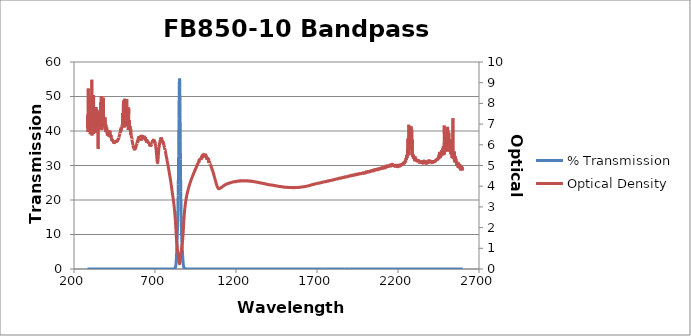
| Category | % Transmission |
|---|---|
| 2600.0 | 0.002 |
| 2599.0 | 0.001 |
| 2598.0 | 0.002 |
| 2597.0 | 0.002 |
| 2596.0 | 0.001 |
| 2595.0 | 0.001 |
| 2594.0 | 0.001 |
| 2593.0 | 0.001 |
| 2592.0 | 0.001 |
| 2591.0 | 0.001 |
| 2590.0 | 0.002 |
| 2589.0 | 0.001 |
| 2588.0 | 0.001 |
| 2587.0 | 0.002 |
| 2586.0 | 0.001 |
| 2585.0 | 0.001 |
| 2584.0 | 0.001 |
| 2583.0 | 0.001 |
| 2582.0 | 0.001 |
| 2581.0 | 0.001 |
| 2580.0 | 0.001 |
| 2579.0 | 0.001 |
| 2578.0 | 0.001 |
| 2577.0 | 0.001 |
| 2576.0 | 0.001 |
| 2575.0 | 0.001 |
| 2574.0 | 0.001 |
| 2573.0 | 0.001 |
| 2572.0 | 0.001 |
| 2571.0 | 0.001 |
| 2570.0 | 0.001 |
| 2569.0 | 0.001 |
| 2568.0 | 0.001 |
| 2567.0 | 0.001 |
| 2566.0 | 0.001 |
| 2565.0 | 0.001 |
| 2564.0 | 0.001 |
| 2563.0 | 0.001 |
| 2562.0 | 0.001 |
| 2561.0 | 0.001 |
| 2560.0 | 0.001 |
| 2559.0 | 0.001 |
| 2558.0 | 0 |
| 2557.0 | 0.001 |
| 2556.0 | 0.001 |
| 2555.0 | 0 |
| 2554.0 | 0.001 |
| 2553.0 | 0 |
| 2552.0 | 0 |
| 2551.0 | 0 |
| 2550.0 | 0.001 |
| 2549.0 | 0 |
| 2548.0 | 0.001 |
| 2547.0 | 0.001 |
| 2546.0 | 0 |
| 2545.0 | 0 |
| 2544.0 | 0 |
| 2543.0 | 0 |
| 2542.0 | 0 |
| 2541.0 | 0 |
| 2540.0 | 0 |
| 2539.0 | 0 |
| 2538.0 | 0 |
| 2537.0 | 0 |
| 2536.0 | 0 |
| 2535.0 | 0 |
| 2534.0 | 0 |
| 2533.0 | 0 |
| 2532.0 | 0 |
| 2531.0 | 0 |
| 2530.0 | 0 |
| 2529.0 | 0 |
| 2528.0 | 0 |
| 2527.0 | 0 |
| 2526.0 | 0 |
| 2525.0 | 0 |
| 2524.0 | 0 |
| 2523.0 | 0 |
| 2522.0 | 0 |
| 2521.0 | 0 |
| 2520.0 | 0 |
| 2519.0 | 0 |
| 2518.0 | 0 |
| 2517.0 | 0 |
| 2516.0 | 0 |
| 2515.0 | 0 |
| 2514.0 | 0 |
| 2513.0 | 0 |
| 2512.0 | 0 |
| 2511.0 | 0 |
| 2510.0 | 0 |
| 2509.0 | 0 |
| 2508.0 | 0 |
| 2507.0 | 0 |
| 2506.0 | 0 |
| 2505.0 | 0 |
| 2504.0 | 0 |
| 2503.0 | 0 |
| 2502.0 | 0 |
| 2501.0 | 0 |
| 2500.0 | 0 |
| 2499.0 | 0 |
| 2498.0 | 0 |
| 2497.0 | 0 |
| 2496.0 | 0 |
| 2495.0 | 0 |
| 2494.0 | 0 |
| 2493.0 | 0 |
| 2492.0 | 0 |
| 2491.0 | 0 |
| 2490.0 | 0 |
| 2489.0 | 0 |
| 2488.0 | 0 |
| 2487.0 | 0 |
| 2486.0 | 0 |
| 2485.0 | 0 |
| 2484.0 | 0 |
| 2483.0 | 0 |
| 2482.0 | 0 |
| 2481.0 | 0 |
| 2480.0 | 0 |
| 2479.0 | 0 |
| 2478.0 | 0 |
| 2477.0 | 0 |
| 2476.0 | 0 |
| 2475.0 | 0 |
| 2474.0 | 0 |
| 2473.0 | 0 |
| 2472.0 | 0 |
| 2471.0 | 0 |
| 2470.0 | 0 |
| 2469.0 | 0 |
| 2468.0 | 0 |
| 2467.0 | 0 |
| 2466.0 | 0 |
| 2465.0 | 0 |
| 2464.0 | 0 |
| 2463.0 | 0 |
| 2462.0 | 0 |
| 2461.0 | 0 |
| 2460.0 | 0 |
| 2459.0 | 0 |
| 2458.0 | 0 |
| 2457.0 | 0 |
| 2456.0 | 0 |
| 2455.0 | 0 |
| 2454.0 | 0 |
| 2453.0 | 0 |
| 2452.0 | 0 |
| 2451.0 | 0.001 |
| 2450.0 | 0 |
| 2449.0 | 0 |
| 2448.0 | 0 |
| 2447.0 | 0 |
| 2446.0 | 0 |
| 2445.0 | 0 |
| 2444.0 | 0 |
| 2443.0 | 0 |
| 2442.0 | 0.001 |
| 2441.0 | 0 |
| 2440.0 | 0.001 |
| 2439.0 | 0.001 |
| 2438.0 | 0 |
| 2437.0 | 0.001 |
| 2436.0 | 0.001 |
| 2435.0 | 0.001 |
| 2434.0 | 0.001 |
| 2433.0 | 0.001 |
| 2432.0 | 0.001 |
| 2431.0 | 0.001 |
| 2430.0 | 0.001 |
| 2429.0 | 0.001 |
| 2428.0 | 0.001 |
| 2427.0 | 0.001 |
| 2426.0 | 0.001 |
| 2425.0 | 0.001 |
| 2424.0 | 0.001 |
| 2423.0 | 0.001 |
| 2422.0 | 0.001 |
| 2421.0 | 0.001 |
| 2420.0 | 0.001 |
| 2419.0 | 0.001 |
| 2418.0 | 0.001 |
| 2417.0 | 0.001 |
| 2416.0 | 0.001 |
| 2415.0 | 0.001 |
| 2414.0 | 0.001 |
| 2413.0 | 0.001 |
| 2412.0 | 0.001 |
| 2411.0 | 0.001 |
| 2410.0 | 0.001 |
| 2409.0 | 0.001 |
| 2408.0 | 0.001 |
| 2407.0 | 0.001 |
| 2406.0 | 0.001 |
| 2405.0 | 0.001 |
| 2404.0 | 0.001 |
| 2403.0 | 0.001 |
| 2402.0 | 0.001 |
| 2401.0 | 0.001 |
| 2400.0 | 0.001 |
| 2399.0 | 0.001 |
| 2398.0 | 0.001 |
| 2397.0 | 0.001 |
| 2396.0 | 0.001 |
| 2395.0 | 0.001 |
| 2394.0 | 0.001 |
| 2393.0 | 0.001 |
| 2392.0 | 0.001 |
| 2391.0 | 0.001 |
| 2390.0 | 0.001 |
| 2389.0 | 0.001 |
| 2388.0 | 0.001 |
| 2387.0 | 0.001 |
| 2386.0 | 0.001 |
| 2385.0 | 0.001 |
| 2384.0 | 0.001 |
| 2383.0 | 0.001 |
| 2382.0 | 0.001 |
| 2381.0 | 0.001 |
| 2380.0 | 0.001 |
| 2379.0 | 0.001 |
| 2378.0 | 0.001 |
| 2377.0 | 0.001 |
| 2376.0 | 0.001 |
| 2375.0 | 0.001 |
| 2374.0 | 0.001 |
| 2373.0 | 0.001 |
| 2372.0 | 0.001 |
| 2371.0 | 0.001 |
| 2370.0 | 0.001 |
| 2369.0 | 0.001 |
| 2368.0 | 0.001 |
| 2367.0 | 0.001 |
| 2366.0 | 0.001 |
| 2365.0 | 0.001 |
| 2364.0 | 0.001 |
| 2363.0 | 0.001 |
| 2362.0 | 0.001 |
| 2361.0 | 0.001 |
| 2360.0 | 0.001 |
| 2359.0 | 0.001 |
| 2358.0 | 0.001 |
| 2357.0 | 0.001 |
| 2356.0 | 0.001 |
| 2355.0 | 0.001 |
| 2354.0 | 0.001 |
| 2353.0 | 0.001 |
| 2352.0 | 0.001 |
| 2351.0 | 0.001 |
| 2350.0 | 0.001 |
| 2349.0 | 0.001 |
| 2348.0 | 0.001 |
| 2347.0 | 0.001 |
| 2346.0 | 0.001 |
| 2345.0 | 0.001 |
| 2344.0 | 0.001 |
| 2343.0 | 0.001 |
| 2342.0 | 0.001 |
| 2341.0 | 0.001 |
| 2340.0 | 0.001 |
| 2339.0 | 0.001 |
| 2338.0 | 0.001 |
| 2337.0 | 0.001 |
| 2336.0 | 0.001 |
| 2335.0 | 0.001 |
| 2334.0 | 0.001 |
| 2333.0 | 0.001 |
| 2332.0 | 0.001 |
| 2331.0 | 0.001 |
| 2330.0 | 0.001 |
| 2329.0 | 0.001 |
| 2328.0 | 0.001 |
| 2327.0 | 0.001 |
| 2326.0 | 0.001 |
| 2325.0 | 0.001 |
| 2324.0 | 0.001 |
| 2323.0 | 0.001 |
| 2322.0 | 0.001 |
| 2321.0 | 0.001 |
| 2320.0 | 0.001 |
| 2319.0 | 0.001 |
| 2318.0 | 0.001 |
| 2317.0 | 0.001 |
| 2316.0 | 0.001 |
| 2315.0 | 0 |
| 2314.0 | 0.001 |
| 2313.0 | 0.001 |
| 2312.0 | 0.001 |
| 2311.0 | 0.001 |
| 2310.0 | 0 |
| 2309.0 | 0 |
| 2308.0 | 0.001 |
| 2307.0 | 0.001 |
| 2306.0 | 0.001 |
| 2305.0 | 0 |
| 2304.0 | 0.001 |
| 2303.0 | 0 |
| 2302.0 | 0.001 |
| 2301.0 | 0 |
| 2300.0 | 0 |
| 2299.0 | 0 |
| 2298.0 | 0 |
| 2297.0 | 0 |
| 2296.0 | 0 |
| 2295.0 | 0 |
| 2294.0 | 0 |
| 2293.0 | 0 |
| 2292.0 | 0 |
| 2291.0 | 0 |
| 2290.0 | 0 |
| 2289.0 | 0 |
| 2288.0 | 0 |
| 2287.0 | 0 |
| 2286.0 | 0 |
| 2285.0 | 0 |
| 2284.0 | 0 |
| 2283.0 | 0 |
| 2282.0 | 0 |
| 2281.0 | 0 |
| 2280.0 | 0 |
| 2279.0 | 0 |
| 2278.0 | 0 |
| 2277.0 | 0 |
| 2276.0 | 0 |
| 2275.0 | 0 |
| 2274.0 | 0 |
| 2273.0 | 0 |
| 2272.0 | 0 |
| 2271.0 | 0 |
| 2270.0 | 0 |
| 2269.0 | 0 |
| 2268.0 | 0 |
| 2267.0 | 0 |
| 2266.0 | 0 |
| 2265.0 | 0 |
| 2264.0 | 0 |
| 2263.0 | 0 |
| 2262.0 | 0 |
| 2261.0 | 0 |
| 2260.0 | 0 |
| 2259.0 | 0 |
| 2258.0 | 0 |
| 2257.0 | 0 |
| 2256.0 | 0 |
| 2255.0 | 0 |
| 2254.0 | 0 |
| 2253.0 | 0 |
| 2252.0 | 0.001 |
| 2251.0 | 0 |
| 2250.0 | 0 |
| 2249.0 | 0 |
| 2248.0 | 0.001 |
| 2247.0 | 0.001 |
| 2246.0 | 0.001 |
| 2245.0 | 0.001 |
| 2244.0 | 0.001 |
| 2243.0 | 0.001 |
| 2242.0 | 0.001 |
| 2241.0 | 0.001 |
| 2240.0 | 0.001 |
| 2239.0 | 0.001 |
| 2238.0 | 0.001 |
| 2237.0 | 0.001 |
| 2236.0 | 0.001 |
| 2235.0 | 0.001 |
| 2234.0 | 0.001 |
| 2233.0 | 0.001 |
| 2232.0 | 0.001 |
| 2231.0 | 0.001 |
| 2230.0 | 0.001 |
| 2229.0 | 0.001 |
| 2228.0 | 0.001 |
| 2227.0 | 0.001 |
| 2226.0 | 0.001 |
| 2225.0 | 0.001 |
| 2224.0 | 0.001 |
| 2223.0 | 0.001 |
| 2222.0 | 0.001 |
| 2221.0 | 0.001 |
| 2220.0 | 0.001 |
| 2219.0 | 0.001 |
| 2218.0 | 0.001 |
| 2217.0 | 0.001 |
| 2216.0 | 0.001 |
| 2215.0 | 0.001 |
| 2214.0 | 0.001 |
| 2213.0 | 0.001 |
| 2212.0 | 0.001 |
| 2211.0 | 0.001 |
| 2210.0 | 0.001 |
| 2209.0 | 0.001 |
| 2208.0 | 0.001 |
| 2207.0 | 0.001 |
| 2206.0 | 0.001 |
| 2205.0 | 0.001 |
| 2204.0 | 0.001 |
| 2203.0 | 0.001 |
| 2202.0 | 0.001 |
| 2201.0 | 0.001 |
| 2200.0 | 0.001 |
| 2199.0 | 0.001 |
| 2198.0 | 0.001 |
| 2197.0 | 0.001 |
| 2196.0 | 0.001 |
| 2195.0 | 0.001 |
| 2194.0 | 0.001 |
| 2193.0 | 0.001 |
| 2192.0 | 0.001 |
| 2191.0 | 0.001 |
| 2190.0 | 0.001 |
| 2189.0 | 0.001 |
| 2188.0 | 0.001 |
| 2187.0 | 0.001 |
| 2186.0 | 0.001 |
| 2185.0 | 0.001 |
| 2184.0 | 0.001 |
| 2183.0 | 0.001 |
| 2182.0 | 0.001 |
| 2181.0 | 0.001 |
| 2180.0 | 0.001 |
| 2179.0 | 0.001 |
| 2178.0 | 0.001 |
| 2177.0 | 0.001 |
| 2176.0 | 0.001 |
| 2175.0 | 0.001 |
| 2174.0 | 0.001 |
| 2173.0 | 0.001 |
| 2172.0 | 0.001 |
| 2171.0 | 0.001 |
| 2170.0 | 0.001 |
| 2169.0 | 0.001 |
| 2168.0 | 0.001 |
| 2167.0 | 0.001 |
| 2166.0 | 0.001 |
| 2165.0 | 0.001 |
| 2164.0 | 0.001 |
| 2163.0 | 0.001 |
| 2162.0 | 0.001 |
| 2161.0 | 0.001 |
| 2160.0 | 0.001 |
| 2159.0 | 0.001 |
| 2158.0 | 0.001 |
| 2157.0 | 0.001 |
| 2156.0 | 0.001 |
| 2155.0 | 0.001 |
| 2154.0 | 0.001 |
| 2153.0 | 0.001 |
| 2152.0 | 0.001 |
| 2151.0 | 0.001 |
| 2150.0 | 0.001 |
| 2149.0 | 0.001 |
| 2148.0 | 0.001 |
| 2147.0 | 0.001 |
| 2146.0 | 0.001 |
| 2145.0 | 0.001 |
| 2144.0 | 0.001 |
| 2143.0 | 0.001 |
| 2142.0 | 0.001 |
| 2141.0 | 0.001 |
| 2140.0 | 0.001 |
| 2139.0 | 0.001 |
| 2138.0 | 0.001 |
| 2137.0 | 0.001 |
| 2136.0 | 0.001 |
| 2135.0 | 0.001 |
| 2134.0 | 0.001 |
| 2133.0 | 0.001 |
| 2132.0 | 0.001 |
| 2131.0 | 0.001 |
| 2130.0 | 0.001 |
| 2129.0 | 0.001 |
| 2128.0 | 0.001 |
| 2127.0 | 0.001 |
| 2126.0 | 0.001 |
| 2125.0 | 0.001 |
| 2124.0 | 0.001 |
| 2123.0 | 0.001 |
| 2122.0 | 0.001 |
| 2121.0 | 0.001 |
| 2120.0 | 0.001 |
| 2119.0 | 0.001 |
| 2118.0 | 0.001 |
| 2117.0 | 0.001 |
| 2116.0 | 0.001 |
| 2115.0 | 0.001 |
| 2114.0 | 0.001 |
| 2113.0 | 0.001 |
| 2112.0 | 0.001 |
| 2111.0 | 0.001 |
| 2110.0 | 0.001 |
| 2109.0 | 0.001 |
| 2108.0 | 0.001 |
| 2107.0 | 0.001 |
| 2106.0 | 0.001 |
| 2105.0 | 0.001 |
| 2104.0 | 0.001 |
| 2103.0 | 0.001 |
| 2102.0 | 0.001 |
| 2101.0 | 0.001 |
| 2100.0 | 0.001 |
| 2099.0 | 0.001 |
| 2098.0 | 0.001 |
| 2097.0 | 0.001 |
| 2096.0 | 0.001 |
| 2095.0 | 0.001 |
| 2094.0 | 0.001 |
| 2093.0 | 0.001 |
| 2092.0 | 0.001 |
| 2091.0 | 0.001 |
| 2090.0 | 0.001 |
| 2089.0 | 0.002 |
| 2088.0 | 0.001 |
| 2087.0 | 0.001 |
| 2086.0 | 0.001 |
| 2085.0 | 0.001 |
| 2084.0 | 0.001 |
| 2083.0 | 0.001 |
| 2082.0 | 0.001 |
| 2081.0 | 0.001 |
| 2080.0 | 0.001 |
| 2079.0 | 0.001 |
| 2078.0 | 0.001 |
| 2077.0 | 0.002 |
| 2076.0 | 0.002 |
| 2075.0 | 0.002 |
| 2074.0 | 0.002 |
| 2073.0 | 0.001 |
| 2072.0 | 0.002 |
| 2071.0 | 0.002 |
| 2070.0 | 0.002 |
| 2069.0 | 0.002 |
| 2068.0 | 0.002 |
| 2067.0 | 0.002 |
| 2066.0 | 0.002 |
| 2065.0 | 0.002 |
| 2064.0 | 0.002 |
| 2063.0 | 0.002 |
| 2062.0 | 0.002 |
| 2061.0 | 0.002 |
| 2060.0 | 0.002 |
| 2059.0 | 0.002 |
| 2058.0 | 0.002 |
| 2057.0 | 0.002 |
| 2056.0 | 0.002 |
| 2055.0 | 0.002 |
| 2054.0 | 0.002 |
| 2053.0 | 0.002 |
| 2052.0 | 0.002 |
| 2051.0 | 0.002 |
| 2050.0 | 0.002 |
| 2049.0 | 0.002 |
| 2048.0 | 0.002 |
| 2047.0 | 0.002 |
| 2046.0 | 0.002 |
| 2045.0 | 0.002 |
| 2044.0 | 0.002 |
| 2043.0 | 0.002 |
| 2042.0 | 0.002 |
| 2041.0 | 0.002 |
| 2040.0 | 0.002 |
| 2039.0 | 0.002 |
| 2038.0 | 0.002 |
| 2037.0 | 0.002 |
| 2036.0 | 0.002 |
| 2035.0 | 0.002 |
| 2034.0 | 0.002 |
| 2033.0 | 0.002 |
| 2032.0 | 0.002 |
| 2031.0 | 0.002 |
| 2030.0 | 0.002 |
| 2029.0 | 0.002 |
| 2028.0 | 0.002 |
| 2027.0 | 0.002 |
| 2026.0 | 0.002 |
| 2025.0 | 0.002 |
| 2024.0 | 0.002 |
| 2023.0 | 0.002 |
| 2022.0 | 0.002 |
| 2021.0 | 0.002 |
| 2020.0 | 0.002 |
| 2019.0 | 0.002 |
| 2018.0 | 0.002 |
| 2017.0 | 0.002 |
| 2016.0 | 0.002 |
| 2015.0 | 0.002 |
| 2014.0 | 0.002 |
| 2013.0 | 0.002 |
| 2012.0 | 0.002 |
| 2011.0 | 0.002 |
| 2010.0 | 0.002 |
| 2009.0 | 0.002 |
| 2008.0 | 0.002 |
| 2007.0 | 0.002 |
| 2006.0 | 0.002 |
| 2005.0 | 0.002 |
| 2004.0 | 0.002 |
| 2003.0 | 0.002 |
| 2002.0 | 0.002 |
| 2001.0 | 0.002 |
| 2000.0 | 0.002 |
| 1999.0 | 0.002 |
| 1998.0 | 0.002 |
| 1997.0 | 0.002 |
| 1996.0 | 0.002 |
| 1995.0 | 0.002 |
| 1994.0 | 0.002 |
| 1993.0 | 0.002 |
| 1992.0 | 0.002 |
| 1991.0 | 0.002 |
| 1990.0 | 0.002 |
| 1989.0 | 0.002 |
| 1988.0 | 0.002 |
| 1987.0 | 0.002 |
| 1986.0 | 0.002 |
| 1985.0 | 0.002 |
| 1984.0 | 0.002 |
| 1983.0 | 0.002 |
| 1982.0 | 0.002 |
| 1981.0 | 0.002 |
| 1980.0 | 0.002 |
| 1979.0 | 0.002 |
| 1978.0 | 0.002 |
| 1977.0 | 0.002 |
| 1976.0 | 0.002 |
| 1975.0 | 0.002 |
| 1974.0 | 0.002 |
| 1973.0 | 0.002 |
| 1972.0 | 0.002 |
| 1971.0 | 0.002 |
| 1970.0 | 0.003 |
| 1969.0 | 0.002 |
| 1968.0 | 0.002 |
| 1967.0 | 0.002 |
| 1966.0 | 0.003 |
| 1965.0 | 0.002 |
| 1964.0 | 0.003 |
| 1963.0 | 0.003 |
| 1962.0 | 0.002 |
| 1961.0 | 0.003 |
| 1960.0 | 0.002 |
| 1959.0 | 0.003 |
| 1958.0 | 0.003 |
| 1957.0 | 0.003 |
| 1956.0 | 0.003 |
| 1955.0 | 0.003 |
| 1954.0 | 0.003 |
| 1953.0 | 0.003 |
| 1952.0 | 0.003 |
| 1951.0 | 0.003 |
| 1950.0 | 0.003 |
| 1949.0 | 0.003 |
| 1948.0 | 0.003 |
| 1947.0 | 0.003 |
| 1946.0 | 0.003 |
| 1945.0 | 0.003 |
| 1944.0 | 0.003 |
| 1943.0 | 0.003 |
| 1942.0 | 0.003 |
| 1941.0 | 0.003 |
| 1940.0 | 0.003 |
| 1939.0 | 0.003 |
| 1938.0 | 0.003 |
| 1937.0 | 0.003 |
| 1936.0 | 0.003 |
| 1935.0 | 0.003 |
| 1934.0 | 0.003 |
| 1933.0 | 0.003 |
| 1932.0 | 0.003 |
| 1931.0 | 0.003 |
| 1930.0 | 0.003 |
| 1929.0 | 0.003 |
| 1928.0 | 0.003 |
| 1927.0 | 0.003 |
| 1926.0 | 0.003 |
| 1925.0 | 0.003 |
| 1924.0 | 0.003 |
| 1923.0 | 0.003 |
| 1922.0 | 0.003 |
| 1921.0 | 0.003 |
| 1920.0 | 0.003 |
| 1919.0 | 0.003 |
| 1918.0 | 0.003 |
| 1917.0 | 0.003 |
| 1916.0 | 0.003 |
| 1915.0 | 0.003 |
| 1914.0 | 0.003 |
| 1913.0 | 0.003 |
| 1912.0 | 0.003 |
| 1911.0 | 0.003 |
| 1910.0 | 0.003 |
| 1909.0 | 0.003 |
| 1908.0 | 0.003 |
| 1907.0 | 0.003 |
| 1906.0 | 0.003 |
| 1905.0 | 0.003 |
| 1904.0 | 0.003 |
| 1903.0 | 0.003 |
| 1902.0 | 0.003 |
| 1901.0 | 0.003 |
| 1900.0 | 0.003 |
| 1899.0 | 0.003 |
| 1898.0 | 0.003 |
| 1897.0 | 0.003 |
| 1896.0 | 0.003 |
| 1895.0 | 0.003 |
| 1894.0 | 0.003 |
| 1893.0 | 0.003 |
| 1892.0 | 0.003 |
| 1891.0 | 0.003 |
| 1890.0 | 0.003 |
| 1889.0 | 0.003 |
| 1888.0 | 0.003 |
| 1887.0 | 0.004 |
| 1886.0 | 0.003 |
| 1885.0 | 0.004 |
| 1884.0 | 0.004 |
| 1883.0 | 0.003 |
| 1882.0 | 0.003 |
| 1881.0 | 0.004 |
| 1880.0 | 0.004 |
| 1879.0 | 0.004 |
| 1878.0 | 0.004 |
| 1877.0 | 0.004 |
| 1876.0 | 0.003 |
| 1875.0 | 0.004 |
| 1874.0 | 0.004 |
| 1873.0 | 0.004 |
| 1872.0 | 0.004 |
| 1871.0 | 0.004 |
| 1870.0 | 0.004 |
| 1869.0 | 0.004 |
| 1868.0 | 0.004 |
| 1867.0 | 0.004 |
| 1866.0 | 0.004 |
| 1865.0 | 0.004 |
| 1864.0 | 0.004 |
| 1863.0 | 0.004 |
| 1862.0 | 0.004 |
| 1861.0 | 0.004 |
| 1860.0 | 0.004 |
| 1859.0 | 0.004 |
| 1858.0 | 0.004 |
| 1857.0 | 0.004 |
| 1856.0 | 0.004 |
| 1855.0 | 0.004 |
| 1854.0 | 0.004 |
| 1853.0 | 0.004 |
| 1852.0 | 0.004 |
| 1851.0 | 0.004 |
| 1850.0 | 0.004 |
| 1849.0 | 0.004 |
| 1848.0 | 0.004 |
| 1847.0 | 0.004 |
| 1846.0 | 0.004 |
| 1845.0 | 0.004 |
| 1844.0 | 0.004 |
| 1843.0 | 0.004 |
| 1842.0 | 0.004 |
| 1841.0 | 0.004 |
| 1840.0 | 0.004 |
| 1839.0 | 0.004 |
| 1838.0 | 0.004 |
| 1837.0 | 0.004 |
| 1836.0 | 0.004 |
| 1835.0 | 0.004 |
| 1834.0 | 0.004 |
| 1833.0 | 0.004 |
| 1832.0 | 0.004 |
| 1831.0 | 0.004 |
| 1830.0 | 0.004 |
| 1829.0 | 0.004 |
| 1828.0 | 0.004 |
| 1827.0 | 0.004 |
| 1826.0 | 0.004 |
| 1825.0 | 0.004 |
| 1824.0 | 0.005 |
| 1823.0 | 0.005 |
| 1822.0 | 0.004 |
| 1821.0 | 0.004 |
| 1820.0 | 0.004 |
| 1819.0 | 0.004 |
| 1818.0 | 0.005 |
| 1817.0 | 0.005 |
| 1816.0 | 0.005 |
| 1815.0 | 0.005 |
| 1814.0 | 0.005 |
| 1813.0 | 0.005 |
| 1812.0 | 0.005 |
| 1811.0 | 0.005 |
| 1810.0 | 0.005 |
| 1809.0 | 0.005 |
| 1808.0 | 0.005 |
| 1807.0 | 0.005 |
| 1806.0 | 0.005 |
| 1805.0 | 0.005 |
| 1804.0 | 0.005 |
| 1803.0 | 0.005 |
| 1802.0 | 0.005 |
| 1801.0 | 0.005 |
| 1800.0 | 0.005 |
| 1799.0 | 0.005 |
| 1798.0 | 0.005 |
| 1797.0 | 0.005 |
| 1796.0 | 0.005 |
| 1795.0 | 0.005 |
| 1794.0 | 0.005 |
| 1793.0 | 0.005 |
| 1792.0 | 0.005 |
| 1791.0 | 0.005 |
| 1790.0 | 0.005 |
| 1789.0 | 0.005 |
| 1788.0 | 0.005 |
| 1787.0 | 0.005 |
| 1786.0 | 0.005 |
| 1785.0 | 0.005 |
| 1784.0 | 0.005 |
| 1783.0 | 0.005 |
| 1782.0 | 0.005 |
| 1781.0 | 0.005 |
| 1780.0 | 0.005 |
| 1779.0 | 0.005 |
| 1778.0 | 0.005 |
| 1777.0 | 0.005 |
| 1776.0 | 0.005 |
| 1775.0 | 0.005 |
| 1774.0 | 0.006 |
| 1773.0 | 0.006 |
| 1772.0 | 0.006 |
| 1771.0 | 0.006 |
| 1770.0 | 0.005 |
| 1769.0 | 0.006 |
| 1768.0 | 0.006 |
| 1767.0 | 0.006 |
| 1766.0 | 0.006 |
| 1765.0 | 0.006 |
| 1764.0 | 0.006 |
| 1763.0 | 0.006 |
| 1762.0 | 0.006 |
| 1761.0 | 0.006 |
| 1760.0 | 0.006 |
| 1759.0 | 0.006 |
| 1758.0 | 0.006 |
| 1757.0 | 0.006 |
| 1756.0 | 0.006 |
| 1755.0 | 0.006 |
| 1754.0 | 0.006 |
| 1753.0 | 0.006 |
| 1752.0 | 0.006 |
| 1751.0 | 0.006 |
| 1750.0 | 0.006 |
| 1749.0 | 0.006 |
| 1748.0 | 0.006 |
| 1747.0 | 0.006 |
| 1746.0 | 0.006 |
| 1745.0 | 0.006 |
| 1744.0 | 0.006 |
| 1743.0 | 0.006 |
| 1742.0 | 0.006 |
| 1741.0 | 0.006 |
| 1740.0 | 0.006 |
| 1739.0 | 0.006 |
| 1738.0 | 0.006 |
| 1737.0 | 0.006 |
| 1736.0 | 0.006 |
| 1735.0 | 0.006 |
| 1734.0 | 0.006 |
| 1733.0 | 0.006 |
| 1732.0 | 0.007 |
| 1731.0 | 0.007 |
| 1730.0 | 0.007 |
| 1729.0 | 0.007 |
| 1728.0 | 0.007 |
| 1727.0 | 0.007 |
| 1726.0 | 0.007 |
| 1725.0 | 0.007 |
| 1724.0 | 0.007 |
| 1723.0 | 0.007 |
| 1722.0 | 0.007 |
| 1721.0 | 0.007 |
| 1720.0 | 0.007 |
| 1719.0 | 0.007 |
| 1718.0 | 0.007 |
| 1717.0 | 0.007 |
| 1716.0 | 0.007 |
| 1715.0 | 0.007 |
| 1714.0 | 0.007 |
| 1713.0 | 0.007 |
| 1712.0 | 0.007 |
| 1711.0 | 0.007 |
| 1710.0 | 0.007 |
| 1709.0 | 0.007 |
| 1708.0 | 0.007 |
| 1707.0 | 0.007 |
| 1706.0 | 0.007 |
| 1705.0 | 0.007 |
| 1704.0 | 0.007 |
| 1703.0 | 0.007 |
| 1702.0 | 0.007 |
| 1701.0 | 0.007 |
| 1700.0 | 0.008 |
| 1699.0 | 0.007 |
| 1698.0 | 0.007 |
| 1697.0 | 0.008 |
| 1696.0 | 0.008 |
| 1695.0 | 0.008 |
| 1694.0 | 0.008 |
| 1693.0 | 0.008 |
| 1692.0 | 0.008 |
| 1691.0 | 0.008 |
| 1690.0 | 0.008 |
| 1689.0 | 0.008 |
| 1688.0 | 0.008 |
| 1687.0 | 0.008 |
| 1686.0 | 0.008 |
| 1685.0 | 0.008 |
| 1684.0 | 0.008 |
| 1683.0 | 0.008 |
| 1682.0 | 0.008 |
| 1681.0 | 0.008 |
| 1680.0 | 0.008 |
| 1679.0 | 0.008 |
| 1678.0 | 0.008 |
| 1677.0 | 0.008 |
| 1676.0 | 0.008 |
| 1675.0 | 0.008 |
| 1674.0 | 0.008 |
| 1673.0 | 0.008 |
| 1672.0 | 0.008 |
| 1671.0 | 0.008 |
| 1670.0 | 0.008 |
| 1669.0 | 0.008 |
| 1668.0 | 0.008 |
| 1667.0 | 0.009 |
| 1666.0 | 0.009 |
| 1665.0 | 0.009 |
| 1664.0 | 0.009 |
| 1663.0 | 0.009 |
| 1662.0 | 0.009 |
| 1661.0 | 0.009 |
| 1660.0 | 0.009 |
| 1659.0 | 0.009 |
| 1658.0 | 0.009 |
| 1657.0 | 0.009 |
| 1656.0 | 0.009 |
| 1655.0 | 0.009 |
| 1654.0 | 0.009 |
| 1653.0 | 0.009 |
| 1652.0 | 0.009 |
| 1651.0 | 0.009 |
| 1650.0 | 0.009 |
| 1649.0 | 0.009 |
| 1648.0 | 0.01 |
| 1647.0 | 0.01 |
| 1646.0 | 0.01 |
| 1645.0 | 0.01 |
| 1644.0 | 0.01 |
| 1643.0 | 0.01 |
| 1642.0 | 0.01 |
| 1641.0 | 0.01 |
| 1640.0 | 0.01 |
| 1639.0 | 0.01 |
| 1638.0 | 0.01 |
| 1637.0 | 0.01 |
| 1636.0 | 0.01 |
| 1635.0 | 0.01 |
| 1634.0 | 0.01 |
| 1633.0 | 0.01 |
| 1632.0 | 0.01 |
| 1631.0 | 0.01 |
| 1630.0 | 0.01 |
| 1629.0 | 0.01 |
| 1628.0 | 0.01 |
| 1627.0 | 0.01 |
| 1626.0 | 0.01 |
| 1625.0 | 0.01 |
| 1624.0 | 0.01 |
| 1623.0 | 0.01 |
| 1622.0 | 0.01 |
| 1621.0 | 0.01 |
| 1620.0 | 0.011 |
| 1619.0 | 0.011 |
| 1618.0 | 0.011 |
| 1617.0 | 0.011 |
| 1616.0 | 0.011 |
| 1615.0 | 0.011 |
| 1614.0 | 0.011 |
| 1613.0 | 0.011 |
| 1612.0 | 0.011 |
| 1611.0 | 0.011 |
| 1610.0 | 0.011 |
| 1609.0 | 0.011 |
| 1608.0 | 0.011 |
| 1607.0 | 0.011 |
| 1606.0 | 0.011 |
| 1605.0 | 0.011 |
| 1604.0 | 0.011 |
| 1603.0 | 0.011 |
| 1602.0 | 0.011 |
| 1601.0 | 0.011 |
| 1600.0 | 0.011 |
| 1599.0 | 0.011 |
| 1598.0 | 0.011 |
| 1597.0 | 0.011 |
| 1596.0 | 0.011 |
| 1595.0 | 0.011 |
| 1594.0 | 0.011 |
| 1593.0 | 0.011 |
| 1592.0 | 0.011 |
| 1591.0 | 0.011 |
| 1590.0 | 0.011 |
| 1589.0 | 0.011 |
| 1588.0 | 0.011 |
| 1587.0 | 0.011 |
| 1586.0 | 0.011 |
| 1585.0 | 0.011 |
| 1584.0 | 0.011 |
| 1583.0 | 0.011 |
| 1582.0 | 0.011 |
| 1581.0 | 0.012 |
| 1580.0 | 0.011 |
| 1579.0 | 0.011 |
| 1578.0 | 0.011 |
| 1577.0 | 0.012 |
| 1576.0 | 0.012 |
| 1575.0 | 0.012 |
| 1574.0 | 0.012 |
| 1573.0 | 0.012 |
| 1572.0 | 0.012 |
| 1571.0 | 0.012 |
| 1570.0 | 0.012 |
| 1569.0 | 0.012 |
| 1568.0 | 0.012 |
| 1567.0 | 0.012 |
| 1566.0 | 0.012 |
| 1565.0 | 0.012 |
| 1564.0 | 0.012 |
| 1563.0 | 0.012 |
| 1562.0 | 0.012 |
| 1561.0 | 0.012 |
| 1560.0 | 0.012 |
| 1559.0 | 0.012 |
| 1558.0 | 0.012 |
| 1557.0 | 0.012 |
| 1556.0 | 0.012 |
| 1555.0 | 0.012 |
| 1554.0 | 0.012 |
| 1553.0 | 0.012 |
| 1552.0 | 0.012 |
| 1551.0 | 0.012 |
| 1550.0 | 0.012 |
| 1549.0 | 0.012 |
| 1548.0 | 0.012 |
| 1547.0 | 0.012 |
| 1546.0 | 0.012 |
| 1545.0 | 0.012 |
| 1544.0 | 0.012 |
| 1543.0 | 0.012 |
| 1542.0 | 0.012 |
| 1541.0 | 0.012 |
| 1540.0 | 0.012 |
| 1539.0 | 0.012 |
| 1538.0 | 0.012 |
| 1537.0 | 0.012 |
| 1536.0 | 0.012 |
| 1535.0 | 0.012 |
| 1534.0 | 0.012 |
| 1533.0 | 0.012 |
| 1532.0 | 0.012 |
| 1531.0 | 0.012 |
| 1530.0 | 0.012 |
| 1529.0 | 0.012 |
| 1528.0 | 0.012 |
| 1527.0 | 0.012 |
| 1526.0 | 0.012 |
| 1525.0 | 0.012 |
| 1524.0 | 0.012 |
| 1523.0 | 0.011 |
| 1522.0 | 0.011 |
| 1521.0 | 0.012 |
| 1520.0 | 0.011 |
| 1519.0 | 0.011 |
| 1518.0 | 0.011 |
| 1517.0 | 0.011 |
| 1516.0 | 0.011 |
| 1515.0 | 0.011 |
| 1514.0 | 0.011 |
| 1513.0 | 0.011 |
| 1512.0 | 0.011 |
| 1511.0 | 0.011 |
| 1510.0 | 0.011 |
| 1509.0 | 0.011 |
| 1508.0 | 0.011 |
| 1507.0 | 0.011 |
| 1506.0 | 0.011 |
| 1505.0 | 0.011 |
| 1504.0 | 0.011 |
| 1503.0 | 0.011 |
| 1502.0 | 0.011 |
| 1501.0 | 0.011 |
| 1500.0 | 0.011 |
| 1499.0 | 0.011 |
| 1498.0 | 0.011 |
| 1497.0 | 0.011 |
| 1496.0 | 0.011 |
| 1495.0 | 0.011 |
| 1494.0 | 0.011 |
| 1493.0 | 0.011 |
| 1492.0 | 0.011 |
| 1491.0 | 0.011 |
| 1490.0 | 0.011 |
| 1489.0 | 0.011 |
| 1488.0 | 0.011 |
| 1487.0 | 0.011 |
| 1486.0 | 0.011 |
| 1485.0 | 0.011 |
| 1484.0 | 0.011 |
| 1483.0 | 0.011 |
| 1482.0 | 0.011 |
| 1481.0 | 0.011 |
| 1480.0 | 0.011 |
| 1479.0 | 0.01 |
| 1478.0 | 0.01 |
| 1477.0 | 0.011 |
| 1476.0 | 0.01 |
| 1475.0 | 0.01 |
| 1474.0 | 0.01 |
| 1473.0 | 0.01 |
| 1472.0 | 0.01 |
| 1471.0 | 0.01 |
| 1470.0 | 0.01 |
| 1469.0 | 0.01 |
| 1468.0 | 0.01 |
| 1467.0 | 0.01 |
| 1466.0 | 0.01 |
| 1465.0 | 0.01 |
| 1464.0 | 0.01 |
| 1463.0 | 0.01 |
| 1462.0 | 0.01 |
| 1461.0 | 0.01 |
| 1460.0 | 0.01 |
| 1459.0 | 0.01 |
| 1458.0 | 0.01 |
| 1457.0 | 0.01 |
| 1456.0 | 0.01 |
| 1455.0 | 0.01 |
| 1454.0 | 0.01 |
| 1453.0 | 0.01 |
| 1452.0 | 0.01 |
| 1451.0 | 0.01 |
| 1450.0 | 0.01 |
| 1449.0 | 0.01 |
| 1448.0 | 0.01 |
| 1447.0 | 0.01 |
| 1446.0 | 0.01 |
| 1445.0 | 0.01 |
| 1444.0 | 0.01 |
| 1443.0 | 0.009 |
| 1442.0 | 0.009 |
| 1441.0 | 0.009 |
| 1440.0 | 0.009 |
| 1439.0 | 0.009 |
| 1438.0 | 0.009 |
| 1437.0 | 0.009 |
| 1436.0 | 0.009 |
| 1435.0 | 0.009 |
| 1434.0 | 0.009 |
| 1433.0 | 0.009 |
| 1432.0 | 0.009 |
| 1431.0 | 0.009 |
| 1430.0 | 0.009 |
| 1429.0 | 0.009 |
| 1428.0 | 0.009 |
| 1427.0 | 0.009 |
| 1426.0 | 0.009 |
| 1425.0 | 0.009 |
| 1424.0 | 0.009 |
| 1423.0 | 0.009 |
| 1422.0 | 0.009 |
| 1421.0 | 0.009 |
| 1420.0 | 0.009 |
| 1419.0 | 0.009 |
| 1418.0 | 0.009 |
| 1417.0 | 0.009 |
| 1416.0 | 0.009 |
| 1415.0 | 0.009 |
| 1414.0 | 0.009 |
| 1413.0 | 0.009 |
| 1412.0 | 0.009 |
| 1411.0 | 0.009 |
| 1410.0 | 0.009 |
| 1409.0 | 0.008 |
| 1408.0 | 0.009 |
| 1407.0 | 0.009 |
| 1406.0 | 0.008 |
| 1405.0 | 0.008 |
| 1404.0 | 0.009 |
| 1403.0 | 0.008 |
| 1402.0 | 0.008 |
| 1401.0 | 0.008 |
| 1400.0 | 0.008 |
| 1399.0 | 0.008 |
| 1398.0 | 0.008 |
| 1397.0 | 0.008 |
| 1396.0 | 0.008 |
| 1395.0 | 0.008 |
| 1394.0 | 0.008 |
| 1393.0 | 0.008 |
| 1392.0 | 0.008 |
| 1391.0 | 0.008 |
| 1390.0 | 0.008 |
| 1389.0 | 0.008 |
| 1388.0 | 0.008 |
| 1387.0 | 0.008 |
| 1386.0 | 0.008 |
| 1385.0 | 0.008 |
| 1384.0 | 0.008 |
| 1383.0 | 0.008 |
| 1382.0 | 0.008 |
| 1381.0 | 0.008 |
| 1380.0 | 0.008 |
| 1379.0 | 0.008 |
| 1378.0 | 0.008 |
| 1377.0 | 0.008 |
| 1376.0 | 0.008 |
| 1375.0 | 0.008 |
| 1374.0 | 0.008 |
| 1373.0 | 0.008 |
| 1372.0 | 0.007 |
| 1371.0 | 0.007 |
| 1370.0 | 0.008 |
| 1369.0 | 0.007 |
| 1368.0 | 0.007 |
| 1367.0 | 0.007 |
| 1366.0 | 0.007 |
| 1365.0 | 0.007 |
| 1364.0 | 0.007 |
| 1363.0 | 0.007 |
| 1362.0 | 0.007 |
| 1361.0 | 0.007 |
| 1360.0 | 0.007 |
| 1359.0 | 0.007 |
| 1358.0 | 0.007 |
| 1357.0 | 0.007 |
| 1356.0 | 0.007 |
| 1355.0 | 0.007 |
| 1354.0 | 0.007 |
| 1353.0 | 0.007 |
| 1352.0 | 0.007 |
| 1351.0 | 0.007 |
| 1350.0 | 0.007 |
| 1349.0 | 0.007 |
| 1348.0 | 0.007 |
| 1347.0 | 0.007 |
| 1346.0 | 0.007 |
| 1345.0 | 0.007 |
| 1344.0 | 0.007 |
| 1343.0 | 0.007 |
| 1342.0 | 0.007 |
| 1341.0 | 0.007 |
| 1340.0 | 0.007 |
| 1339.0 | 0.007 |
| 1338.0 | 0.007 |
| 1337.0 | 0.007 |
| 1336.0 | 0.006 |
| 1335.0 | 0.006 |
| 1334.0 | 0.006 |
| 1333.0 | 0.006 |
| 1332.0 | 0.007 |
| 1331.0 | 0.006 |
| 1330.0 | 0.006 |
| 1329.0 | 0.006 |
| 1328.0 | 0.006 |
| 1327.0 | 0.006 |
| 1326.0 | 0.006 |
| 1325.0 | 0.006 |
| 1324.0 | 0.006 |
| 1323.0 | 0.006 |
| 1322.0 | 0.006 |
| 1321.0 | 0.006 |
| 1320.0 | 0.006 |
| 1319.0 | 0.006 |
| 1318.0 | 0.006 |
| 1317.0 | 0.006 |
| 1316.0 | 0.006 |
| 1315.0 | 0.006 |
| 1314.0 | 0.006 |
| 1313.0 | 0.006 |
| 1312.0 | 0.006 |
| 1311.0 | 0.006 |
| 1310.0 | 0.006 |
| 1309.0 | 0.006 |
| 1308.0 | 0.006 |
| 1307.0 | 0.006 |
| 1306.0 | 0.006 |
| 1305.0 | 0.006 |
| 1304.0 | 0.006 |
| 1303.0 | 0.006 |
| 1302.0 | 0.006 |
| 1301.0 | 0.006 |
| 1300.0 | 0.006 |
| 1299.0 | 0.006 |
| 1298.0 | 0.006 |
| 1297.0 | 0.006 |
| 1296.0 | 0.006 |
| 1295.0 | 0.006 |
| 1294.0 | 0.006 |
| 1293.0 | 0.006 |
| 1292.0 | 0.006 |
| 1291.0 | 0.006 |
| 1290.0 | 0.006 |
| 1289.0 | 0.006 |
| 1288.0 | 0.006 |
| 1287.0 | 0.006 |
| 1286.0 | 0.006 |
| 1285.0 | 0.006 |
| 1284.0 | 0.006 |
| 1283.0 | 0.006 |
| 1282.0 | 0.006 |
| 1281.0 | 0.006 |
| 1280.0 | 0.006 |
| 1279.0 | 0.006 |
| 1278.0 | 0.006 |
| 1277.0 | 0.006 |
| 1276.0 | 0.006 |
| 1275.0 | 0.006 |
| 1274.0 | 0.006 |
| 1273.0 | 0.006 |
| 1272.0 | 0.006 |
| 1271.0 | 0.006 |
| 1270.0 | 0.005 |
| 1269.0 | 0.005 |
| 1268.0 | 0.006 |
| 1267.0 | 0.005 |
| 1266.0 | 0.005 |
| 1265.0 | 0.006 |
| 1264.0 | 0.005 |
| 1263.0 | 0.006 |
| 1262.0 | 0.006 |
| 1261.0 | 0.005 |
| 1260.0 | 0.005 |
| 1259.0 | 0.005 |
| 1258.0 | 0.005 |
| 1257.0 | 0.006 |
| 1256.0 | 0.005 |
| 1255.0 | 0.006 |
| 1254.0 | 0.005 |
| 1253.0 | 0.006 |
| 1252.0 | 0.005 |
| 1251.0 | 0.006 |
| 1250.0 | 0.005 |
| 1249.0 | 0.006 |
| 1248.0 | 0.005 |
| 1247.0 | 0.006 |
| 1246.0 | 0.005 |
| 1245.0 | 0.005 |
| 1244.0 | 0.006 |
| 1243.0 | 0.005 |
| 1242.0 | 0.006 |
| 1241.0 | 0.005 |
| 1240.0 | 0.006 |
| 1239.0 | 0.005 |
| 1238.0 | 0.005 |
| 1237.0 | 0.006 |
| 1236.0 | 0.006 |
| 1235.0 | 0.006 |
| 1234.0 | 0.006 |
| 1233.0 | 0.005 |
| 1232.0 | 0.006 |
| 1231.0 | 0.006 |
| 1230.0 | 0.005 |
| 1229.0 | 0.006 |
| 1228.0 | 0.006 |
| 1227.0 | 0.006 |
| 1226.0 | 0.005 |
| 1225.0 | 0.006 |
| 1224.0 | 0.006 |
| 1223.0 | 0.006 |
| 1222.0 | 0.006 |
| 1221.0 | 0.006 |
| 1220.0 | 0.006 |
| 1219.0 | 0.006 |
| 1218.0 | 0.006 |
| 1217.0 | 0.006 |
| 1216.0 | 0.006 |
| 1215.0 | 0.006 |
| 1214.0 | 0.006 |
| 1213.0 | 0.006 |
| 1212.0 | 0.006 |
| 1211.0 | 0.006 |
| 1210.0 | 0.006 |
| 1209.0 | 0.006 |
| 1208.0 | 0.006 |
| 1207.0 | 0.006 |
| 1206.0 | 0.006 |
| 1205.0 | 0.006 |
| 1204.0 | 0.006 |
| 1203.0 | 0.006 |
| 1202.0 | 0.006 |
| 1201.0 | 0.006 |
| 1200.0 | 0.006 |
| 1199.0 | 0.006 |
| 1198.0 | 0.006 |
| 1197.0 | 0.006 |
| 1196.0 | 0.006 |
| 1195.0 | 0.006 |
| 1194.0 | 0.006 |
| 1193.0 | 0.006 |
| 1192.0 | 0.006 |
| 1191.0 | 0.006 |
| 1190.0 | 0.006 |
| 1189.0 | 0.006 |
| 1188.0 | 0.006 |
| 1187.0 | 0.006 |
| 1186.0 | 0.006 |
| 1185.0 | 0.006 |
| 1184.0 | 0.006 |
| 1183.0 | 0.006 |
| 1182.0 | 0.006 |
| 1181.0 | 0.006 |
| 1180.0 | 0.006 |
| 1179.0 | 0.006 |
| 1178.0 | 0.006 |
| 1177.0 | 0.006 |
| 1176.0 | 0.006 |
| 1175.0 | 0.006 |
| 1174.0 | 0.006 |
| 1173.0 | 0.006 |
| 1172.0 | 0.007 |
| 1171.0 | 0.007 |
| 1170.0 | 0.007 |
| 1169.0 | 0.007 |
| 1168.0 | 0.007 |
| 1167.0 | 0.007 |
| 1166.0 | 0.007 |
| 1165.0 | 0.007 |
| 1164.0 | 0.007 |
| 1163.0 | 0.007 |
| 1162.0 | 0.007 |
| 1161.0 | 0.007 |
| 1160.0 | 0.007 |
| 1159.0 | 0.007 |
| 1158.0 | 0.007 |
| 1157.0 | 0.007 |
| 1156.0 | 0.007 |
| 1155.0 | 0.007 |
| 1154.0 | 0.007 |
| 1153.0 | 0.007 |
| 1152.0 | 0.007 |
| 1151.0 | 0.007 |
| 1150.0 | 0.008 |
| 1149.0 | 0.007 |
| 1148.0 | 0.008 |
| 1147.0 | 0.008 |
| 1146.0 | 0.008 |
| 1145.0 | 0.008 |
| 1144.0 | 0.008 |
| 1143.0 | 0.008 |
| 1142.0 | 0.008 |
| 1141.0 | 0.008 |
| 1140.0 | 0.008 |
| 1139.0 | 0.008 |
| 1138.0 | 0.008 |
| 1137.0 | 0.008 |
| 1136.0 | 0.008 |
| 1135.0 | 0.008 |
| 1134.0 | 0.008 |
| 1133.0 | 0.009 |
| 1132.0 | 0.009 |
| 1131.0 | 0.009 |
| 1130.0 | 0.009 |
| 1129.0 | 0.009 |
| 1128.0 | 0.009 |
| 1127.0 | 0.009 |
| 1126.0 | 0.009 |
| 1125.0 | 0.009 |
| 1124.0 | 0.01 |
| 1123.0 | 0.01 |
| 1122.0 | 0.01 |
| 1121.0 | 0.01 |
| 1120.0 | 0.01 |
| 1119.0 | 0.01 |
| 1118.0 | 0.01 |
| 1117.0 | 0.01 |
| 1116.0 | 0.01 |
| 1115.0 | 0.011 |
| 1114.0 | 0.011 |
| 1113.0 | 0.011 |
| 1112.0 | 0.011 |
| 1111.0 | 0.011 |
| 1110.0 | 0.011 |
| 1109.0 | 0.012 |
| 1108.0 | 0.012 |
| 1107.0 | 0.012 |
| 1106.0 | 0.012 |
| 1105.0 | 0.012 |
| 1104.0 | 0.012 |
| 1103.0 | 0.012 |
| 1102.0 | 0.013 |
| 1101.0 | 0.013 |
| 1100.0 | 0.013 |
| 1099.0 | 0.013 |
| 1098.0 | 0.013 |
| 1097.0 | 0.013 |
| 1096.0 | 0.013 |
| 1095.0 | 0.013 |
| 1094.0 | 0.013 |
| 1093.0 | 0.013 |
| 1092.0 | 0.013 |
| 1091.0 | 0.013 |
| 1090.0 | 0.013 |
| 1089.0 | 0.012 |
| 1088.0 | 0.012 |
| 1087.0 | 0.012 |
| 1086.0 | 0.011 |
| 1085.0 | 0.011 |
| 1084.0 | 0.01 |
| 1083.0 | 0.01 |
| 1082.0 | 0.009 |
| 1081.0 | 0.009 |
| 1080.0 | 0.008 |
| 1079.0 | 0.008 |
| 1078.0 | 0.007 |
| 1077.0 | 0.007 |
| 1076.0 | 0.007 |
| 1075.0 | 0.006 |
| 1074.0 | 0.006 |
| 1073.0 | 0.005 |
| 1072.0 | 0.005 |
| 1071.0 | 0.005 |
| 1070.0 | 0.004 |
| 1069.0 | 0.004 |
| 1068.0 | 0.004 |
| 1067.0 | 0.004 |
| 1066.0 | 0.003 |
| 1065.0 | 0.003 |
| 1064.0 | 0.003 |
| 1063.0 | 0.003 |
| 1062.0 | 0.003 |
| 1061.0 | 0.003 |
| 1060.0 | 0.002 |
| 1059.0 | 0.002 |
| 1058.0 | 0.002 |
| 1057.0 | 0.002 |
| 1056.0 | 0.002 |
| 1055.0 | 0.002 |
| 1054.0 | 0.002 |
| 1053.0 | 0.002 |
| 1052.0 | 0.002 |
| 1051.0 | 0.001 |
| 1050.0 | 0.001 |
| 1049.0 | 0.001 |
| 1048.0 | 0.001 |
| 1047.0 | 0.001 |
| 1046.0 | 0.001 |
| 1045.0 | 0.001 |
| 1044.0 | 0.001 |
| 1043.0 | 0.001 |
| 1042.0 | 0.001 |
| 1041.0 | 0.001 |
| 1040.0 | 0.001 |
| 1039.0 | 0.001 |
| 1038.0 | 0.001 |
| 1037.0 | 0.001 |
| 1036.0 | 0.001 |
| 1035.0 | 0.001 |
| 1034.0 | 0.001 |
| 1033.0 | 0.001 |
| 1032.0 | 0.001 |
| 1031.0 | 0 |
| 1030.0 | 0.001 |
| 1029.0 | 0 |
| 1028.0 | 0.001 |
| 1027.0 | 0.001 |
| 1026.0 | 0 |
| 1025.0 | 0.001 |
| 1024.0 | 0 |
| 1023.0 | 0 |
| 1022.0 | 0 |
| 1021.0 | 0 |
| 1020.0 | 0.001 |
| 1019.0 | 0 |
| 1018.0 | 0 |
| 1017.0 | 0 |
| 1016.0 | 0 |
| 1015.0 | 0 |
| 1014.0 | 0 |
| 1013.0 | 0 |
| 1012.0 | 0 |
| 1011.0 | 0 |
| 1010.0 | 0 |
| 1009.0 | 0 |
| 1008.0 | 0 |
| 1007.0 | 0 |
| 1006.0 | 0 |
| 1005.0 | 0 |
| 1004.0 | 0 |
| 1003.0 | 0 |
| 1002.0 | 0 |
| 1001.0 | 0 |
| 1000.0 | 0 |
| 999.0 | 0 |
| 998.0 | 0 |
| 997.0 | 0 |
| 996.0 | 0 |
| 995.0 | 0 |
| 994.0 | 0 |
| 993.0 | 0 |
| 992.0 | 0 |
| 991.0 | 0 |
| 990.0 | 0 |
| 989.0 | 0 |
| 988.0 | 0 |
| 987.0 | 0 |
| 986.0 | 0 |
| 985.0 | 0 |
| 984.0 | 0.001 |
| 983.0 | 0 |
| 982.0 | 0 |
| 981.0 | 0 |
| 980.0 | 0.001 |
| 979.0 | 0 |
| 978.0 | 0 |
| 977.0 | 0 |
| 976.0 | 0.001 |
| 975.0 | 0.001 |
| 974.0 | 0.001 |
| 973.0 | 0.001 |
| 972.0 | 0.001 |
| 971.0 | 0.001 |
| 970.0 | 0.001 |
| 969.0 | 0.001 |
| 968.0 | 0.001 |
| 967.0 | 0.001 |
| 966.0 | 0.001 |
| 965.0 | 0.001 |
| 964.0 | 0.001 |
| 963.0 | 0.001 |
| 962.0 | 0.001 |
| 961.0 | 0.001 |
| 960.0 | 0.001 |
| 959.0 | 0.001 |
| 958.0 | 0.001 |
| 957.0 | 0.001 |
| 956.0 | 0.001 |
| 955.0 | 0.001 |
| 954.0 | 0.001 |
| 953.0 | 0.001 |
| 952.0 | 0.001 |
| 951.0 | 0.001 |
| 950.0 | 0.001 |
| 949.0 | 0.002 |
| 948.0 | 0.002 |
| 947.0 | 0.002 |
| 946.0 | 0.002 |
| 945.0 | 0.002 |
| 944.0 | 0.002 |
| 943.0 | 0.002 |
| 942.0 | 0.002 |
| 941.0 | 0.002 |
| 940.0 | 0.002 |
| 939.0 | 0.002 |
| 938.0 | 0.002 |
| 937.0 | 0.003 |
| 936.0 | 0.003 |
| 935.0 | 0.003 |
| 934.0 | 0.003 |
| 933.0 | 0.003 |
| 932.0 | 0.003 |
| 931.0 | 0.003 |
| 930.0 | 0.003 |
| 929.0 | 0.004 |
| 928.0 | 0.004 |
| 927.0 | 0.004 |
| 926.0 | 0.004 |
| 925.0 | 0.004 |
| 924.0 | 0.005 |
| 923.0 | 0.005 |
| 922.0 | 0.005 |
| 921.0 | 0.006 |
| 920.0 | 0.006 |
| 919.0 | 0.006 |
| 918.0 | 0.006 |
| 917.0 | 0.007 |
| 916.0 | 0.007 |
| 915.0 | 0.008 |
| 914.0 | 0.008 |
| 913.0 | 0.009 |
| 912.0 | 0.009 |
| 911.0 | 0.01 |
| 910.0 | 0.01 |
| 909.0 | 0.011 |
| 908.0 | 0.012 |
| 907.0 | 0.012 |
| 906.0 | 0.013 |
| 905.0 | 0.014 |
| 904.0 | 0.015 |
| 903.0 | 0.016 |
| 902.0 | 0.017 |
| 901.0 | 0.019 |
| 900.0 | 0.02 |
| 899.0 | 0.022 |
| 898.0 | 0.024 |
| 897.0 | 0.026 |
| 896.0 | 0.028 |
| 895.0 | 0.031 |
| 894.0 | 0.034 |
| 893.0 | 0.038 |
| 892.0 | 0.042 |
| 891.0 | 0.047 |
| 890.0 | 0.052 |
| 889.0 | 0.059 |
| 888.0 | 0.067 |
| 887.0 | 0.077 |
| 886.0 | 0.089 |
| 885.0 | 0.103 |
| 884.0 | 0.122 |
| 883.0 | 0.145 |
| 882.0 | 0.177 |
| 881.0 | 0.22 |
| 880.0 | 0.28 |
| 879.0 | 0.364 |
| 878.0 | 0.484 |
| 877.0 | 0.663 |
| 876.0 | 0.908 |
| 875.0 | 1.224 |
| 874.0 | 1.642 |
| 873.0 | 2.152 |
| 872.0 | 2.773 |
| 871.0 | 3.52 |
| 870.0 | 4.401 |
| 869.0 | 5.277 |
| 868.0 | 6.041 |
| 867.0 | 6.866 |
| 866.0 | 7.769 |
| 865.0 | 8.899 |
| 864.0 | 10.238 |
| 863.0 | 11.827 |
| 862.0 | 13.821 |
| 861.0 | 16.191 |
| 860.0 | 19.048 |
| 859.0 | 22.417 |
| 858.0 | 26.629 |
| 857.0 | 31.662 |
| 856.0 | 37.329 |
| 855.0 | 43.196 |
| 854.0 | 48.451 |
| 853.0 | 52.659 |
| 852.0 | 55.065 |
| 851.0 | 55.235 |
| 850.0 | 53.164 |
| 849.0 | 48.956 |
| 848.0 | 43.629 |
| 847.0 | 38.238 |
| 846.0 | 32.973 |
| 845.0 | 28.428 |
| 844.0 | 24.574 |
| 843.0 | 21.292 |
| 842.0 | 18.556 |
| 841.0 | 16.236 |
| 840.0 | 14.283 |
| 839.0 | 12.429 |
| 838.0 | 10.73 |
| 837.0 | 9.145 |
| 836.0 | 7.659 |
| 835.0 | 6.284 |
| 834.0 | 5.061 |
| 833.0 | 3.972 |
| 832.0 | 3.029 |
| 831.0 | 2.284 |
| 830.0 | 1.663 |
| 829.0 | 1.206 |
| 828.0 | 0.89 |
| 827.0 | 0.654 |
| 826.0 | 0.491 |
| 825.0 | 0.377 |
| 824.0 | 0.294 |
| 823.0 | 0.233 |
| 822.0 | 0.19 |
| 821.0 | 0.158 |
| 820.0 | 0.131 |
| 819.0 | 0.11 |
| 818.0 | 0.094 |
| 817.0 | 0.08 |
| 816.0 | 0.068 |
| 815.0 | 0.059 |
| 814.0 | 0.052 |
| 813.0 | 0.045 |
| 812.0 | 0.039 |
| 811.0 | 0.034 |
| 810.0 | 0.03 |
| 809.0 | 0.027 |
| 808.0 | 0.024 |
| 807.0 | 0.021 |
| 806.0 | 0.018 |
| 805.0 | 0.016 |
| 804.0 | 0.014 |
| 803.0 | 0.013 |
| 802.0 | 0.011 |
| 801.0 | 0.009 |
| 800.0 | 0.009 |
| 799.0 | 0.007 |
| 798.0 | 0.006 |
| 797.0 | 0.006 |
| 796.0 | 0.005 |
| 795.0 | 0.005 |
| 794.0 | 0.004 |
| 793.0 | 0.004 |
| 792.0 | 0.003 |
| 791.0 | 0.003 |
| 790.0 | 0.003 |
| 789.0 | 0.002 |
| 788.0 | 0.002 |
| 787.0 | 0.002 |
| 786.0 | 0.002 |
| 785.0 | 0.002 |
| 784.0 | 0.001 |
| 783.0 | 0.001 |
| 782.0 | 0.001 |
| 781.0 | 0.001 |
| 780.0 | 0.001 |
| 779.0 | 0.001 |
| 778.0 | 0.001 |
| 777.0 | 0.001 |
| 776.0 | 0.001 |
| 775.0 | 0.001 |
| 774.0 | 0.001 |
| 773.0 | 0 |
| 772.0 | 0 |
| 771.0 | 0 |
| 770.0 | 0 |
| 769.0 | 0 |
| 768.0 | 0 |
| 767.0 | 0 |
| 766.0 | 0 |
| 765.0 | 0 |
| 764.0 | 0 |
| 763.0 | 0 |
| 762.0 | 0 |
| 761.0 | 0 |
| 760.0 | 0 |
| 759.0 | 0 |
| 758.0 | 0 |
| 757.0 | 0 |
| 756.0 | 0 |
| 755.0 | 0 |
| 754.0 | 0 |
| 753.0 | 0 |
| 752.0 | 0 |
| 751.0 | 0 |
| 750.0 | 0 |
| 749.0 | 0 |
| 748.0 | 0 |
| 747.0 | 0 |
| 746.0 | 0 |
| 745.0 | 0 |
| 744.0 | 0 |
| 743.0 | 0 |
| 742.0 | 0 |
| 741.0 | 0 |
| 740.0 | 0 |
| 739.0 | 0 |
| 738.0 | 0 |
| 737.0 | 0 |
| 736.0 | 0 |
| 735.0 | 0 |
| 734.0 | 0 |
| 733.0 | 0 |
| 732.0 | 0 |
| 731.0 | 0 |
| 730.0 | 0 |
| 729.0 | 0 |
| 728.0 | 0 |
| 727.0 | 0 |
| 726.0 | 0 |
| 725.0 | 0 |
| 724.0 | 0 |
| 723.0 | 0 |
| 722.0 | 0 |
| 721.0 | 0 |
| 720.0 | 0 |
| 719.0 | 0 |
| 718.0 | 0.001 |
| 717.0 | 0.001 |
| 716.0 | 0.001 |
| 715.0 | 0.001 |
| 714.0 | 0.001 |
| 713.0 | 0.001 |
| 712.0 | 0.001 |
| 711.0 | 0 |
| 710.0 | 0 |
| 709.0 | 0 |
| 708.0 | 0 |
| 707.0 | 0 |
| 706.0 | 0 |
| 705.0 | 0 |
| 704.0 | 0 |
| 703.0 | 0 |
| 702.0 | 0 |
| 701.0 | 0 |
| 700.0 | 0 |
| 699.0 | 0 |
| 698.0 | 0 |
| 697.0 | 0 |
| 696.0 | 0 |
| 695.0 | 0 |
| 694.0 | 0 |
| 693.0 | 0 |
| 692.0 | 0 |
| 691.0 | 0 |
| 690.0 | 0 |
| 689.0 | 0 |
| 688.0 | 0 |
| 687.0 | 0 |
| 686.0 | 0 |
| 685.0 | 0 |
| 684.0 | 0 |
| 683.0 | 0 |
| 682.0 | 0 |
| 681.0 | 0 |
| 680.0 | 0 |
| 679.0 | 0 |
| 678.0 | 0 |
| 677.0 | 0 |
| 676.0 | 0 |
| 675.0 | 0 |
| 674.0 | 0 |
| 673.0 | 0 |
| 672.0 | 0 |
| 671.0 | 0 |
| 670.0 | 0 |
| 669.0 | 0 |
| 668.0 | 0 |
| 667.0 | 0 |
| 666.0 | 0 |
| 665.0 | 0 |
| 664.0 | 0 |
| 663.0 | 0 |
| 662.0 | 0 |
| 661.0 | 0 |
| 660.0 | 0 |
| 659.0 | 0 |
| 658.0 | 0 |
| 657.0 | 0 |
| 656.0 | 0 |
| 655.0 | 0 |
| 654.0 | 0 |
| 653.0 | 0 |
| 652.0 | 0 |
| 651.0 | 0 |
| 650.0 | 0 |
| 649.0 | 0 |
| 648.0 | 0 |
| 647.0 | 0 |
| 646.0 | 0 |
| 645.0 | 0 |
| 644.0 | 0 |
| 643.0 | 0 |
| 642.0 | 0 |
| 641.0 | 0 |
| 640.0 | 0 |
| 639.0 | 0 |
| 638.0 | 0 |
| 637.0 | 0 |
| 636.0 | 0 |
| 635.0 | 0 |
| 634.0 | 0 |
| 633.0 | 0 |
| 632.0 | 0 |
| 631.0 | 0 |
| 630.0 | 0 |
| 629.0 | 0 |
| 628.0 | 0 |
| 627.0 | 0 |
| 626.0 | 0 |
| 625.0 | 0 |
| 624.0 | 0 |
| 623.0 | 0 |
| 622.0 | 0 |
| 621.0 | 0 |
| 620.0 | 0 |
| 619.0 | 0 |
| 618.0 | 0 |
| 617.0 | 0 |
| 616.0 | 0 |
| 615.0 | 0 |
| 614.0 | 0 |
| 613.0 | 0 |
| 612.0 | 0 |
| 611.0 | 0 |
| 610.0 | 0 |
| 609.0 | 0 |
| 608.0 | 0 |
| 607.0 | 0 |
| 606.0 | 0 |
| 605.0 | 0 |
| 604.0 | 0 |
| 603.0 | 0 |
| 602.0 | 0 |
| 601.0 | 0 |
| 600.0 | 0 |
| 599.0 | 0 |
| 598.0 | 0 |
| 597.0 | 0 |
| 596.0 | 0 |
| 595.0 | 0 |
| 594.0 | 0 |
| 593.0 | 0 |
| 592.0 | 0 |
| 591.0 | 0 |
| 590.0 | 0 |
| 589.0 | 0 |
| 588.0 | 0 |
| 587.0 | 0 |
| 586.0 | 0 |
| 585.0 | 0 |
| 584.0 | 0 |
| 583.0 | 0 |
| 582.0 | 0 |
| 581.0 | 0 |
| 580.0 | 0 |
| 579.0 | 0 |
| 578.0 | 0 |
| 577.0 | 0 |
| 576.0 | 0 |
| 575.0 | 0 |
| 574.0 | 0 |
| 573.0 | 0 |
| 572.0 | 0 |
| 571.0 | 0 |
| 570.0 | 0 |
| 569.0 | 0 |
| 568.0 | 0 |
| 567.0 | 0 |
| 566.0 | 0 |
| 565.0 | 0 |
| 564.0 | 0 |
| 563.0 | 0 |
| 562.0 | 0 |
| 561.0 | 0 |
| 560.0 | 0 |
| 559.0 | 0 |
| 558.0 | 0 |
| 557.0 | 0 |
| 556.0 | 0 |
| 555.0 | 0 |
| 554.0 | 0 |
| 553.0 | 0 |
| 552.0 | 0 |
| 551.0 | 0 |
| 550.0 | 0 |
| 549.0 | 0 |
| 548.0 | 0 |
| 547.0 | 0 |
| 546.0 | 0 |
| 545.0 | 0 |
| 544.0 | 0 |
| 543.0 | 0 |
| 542.0 | 0 |
| 541.0 | 0 |
| 540.0 | 0 |
| 539.0 | 0 |
| 538.0 | 0 |
| 537.0 | 0 |
| 536.0 | 0 |
| 535.0 | 0 |
| 534.0 | 0 |
| 533.0 | 0 |
| 532.0 | 0 |
| 531.0 | 0 |
| 530.0 | 0 |
| 529.0 | 0 |
| 528.0 | 0 |
| 527.0 | 0 |
| 526.0 | 0 |
| 525.0 | 0 |
| 524.0 | 0 |
| 523.0 | 0 |
| 522.0 | 0 |
| 521.0 | 0 |
| 520.0 | 0 |
| 519.0 | 0 |
| 518.0 | 0 |
| 517.0 | 0 |
| 516.0 | 0 |
| 515.0 | 0 |
| 514.0 | 0 |
| 513.0 | 0 |
| 512.0 | 0 |
| 511.0 | 0 |
| 510.0 | 0 |
| 509.0 | 0 |
| 508.0 | 0 |
| 507.0 | 0 |
| 506.0 | 0 |
| 505.0 | 0 |
| 504.0 | 0 |
| 503.0 | 0 |
| 502.0 | 0 |
| 501.0 | 0 |
| 500.0 | 0 |
| 499.0 | 0 |
| 498.0 | 0 |
| 497.0 | 0 |
| 496.0 | 0 |
| 495.0 | 0 |
| 494.0 | 0 |
| 493.0 | 0 |
| 492.0 | 0 |
| 491.0 | 0 |
| 490.0 | 0 |
| 489.0 | 0 |
| 488.0 | 0 |
| 487.0 | 0 |
| 486.0 | 0 |
| 485.0 | 0 |
| 484.0 | 0 |
| 483.0 | 0 |
| 482.0 | 0 |
| 481.0 | 0 |
| 480.0 | 0 |
| 479.0 | 0 |
| 478.0 | 0 |
| 477.0 | 0 |
| 476.0 | 0 |
| 475.0 | 0 |
| 474.0 | 0 |
| 473.0 | 0 |
| 472.0 | 0 |
| 471.0 | 0 |
| 470.0 | 0 |
| 469.0 | 0 |
| 468.0 | 0 |
| 467.0 | 0 |
| 466.0 | 0 |
| 465.0 | 0 |
| 464.0 | 0 |
| 463.0 | 0 |
| 462.0 | 0 |
| 461.0 | 0 |
| 460.0 | 0 |
| 459.0 | 0 |
| 458.0 | 0 |
| 457.0 | 0 |
| 456.0 | 0 |
| 455.0 | 0 |
| 454.0 | 0 |
| 453.0 | 0 |
| 452.0 | 0 |
| 451.0 | 0 |
| 450.0 | 0 |
| 449.0 | 0 |
| 448.0 | 0 |
| 447.0 | 0 |
| 446.0 | 0 |
| 445.0 | 0 |
| 444.0 | 0 |
| 443.0 | 0 |
| 442.0 | 0 |
| 441.0 | 0 |
| 440.0 | 0 |
| 439.0 | 0 |
| 438.0 | 0 |
| 437.0 | 0 |
| 436.0 | 0 |
| 435.0 | 0 |
| 434.0 | 0 |
| 433.0 | 0 |
| 432.0 | 0 |
| 431.0 | 0 |
| 430.0 | 0 |
| 429.0 | 0 |
| 428.0 | 0 |
| 427.0 | 0 |
| 426.0 | 0 |
| 425.0 | 0 |
| 424.0 | 0 |
| 423.0 | 0 |
| 422.0 | 0 |
| 421.0 | 0 |
| 420.0 | 0 |
| 419.0 | 0 |
| 418.0 | 0 |
| 417.0 | 0 |
| 416.0 | 0 |
| 415.0 | 0 |
| 414.0 | 0 |
| 413.0 | 0 |
| 412.0 | 0 |
| 411.0 | 0 |
| 410.0 | 0 |
| 409.0 | 0 |
| 408.0 | 0 |
| 407.0 | 0 |
| 406.0 | 0 |
| 405.0 | 0 |
| 404.0 | 0 |
| 403.0 | 0 |
| 402.0 | 0 |
| 401.0 | 0 |
| 400.0 | 0 |
| 399.0 | 0 |
| 398.0 | 0 |
| 397.0 | 0 |
| 396.0 | 0 |
| 395.0 | 0 |
| 394.0 | 0 |
| 393.0 | 0 |
| 392.0 | 0 |
| 391.0 | 0 |
| 390.0 | 0 |
| 389.0 | 0 |
| 388.0 | 0 |
| 387.0 | 0 |
| 386.0 | 0 |
| 385.0 | 0 |
| 384.0 | 0 |
| 383.0 | 0 |
| 382.0 | 0 |
| 381.0 | 0 |
| 380.0 | 0 |
| 379.0 | 0 |
| 378.0 | 0 |
| 377.0 | 0 |
| 376.0 | 0 |
| 375.0 | 0 |
| 374.0 | 0 |
| 373.0 | 0 |
| 372.0 | 0 |
| 371.0 | 0 |
| 370.0 | 0 |
| 369.0 | 0 |
| 368.0 | 0 |
| 367.0 | 0 |
| 366.0 | 0 |
| 365.0 | 0 |
| 364.0 | 0 |
| 363.0 | 0 |
| 362.0 | 0 |
| 361.0 | 0 |
| 360.0 | 0 |
| 359.0 | 0 |
| 358.0 | 0 |
| 357.0 | 0 |
| 356.0 | 0 |
| 355.0 | 0 |
| 354.0 | 0 |
| 353.0 | 0 |
| 352.0 | 0 |
| 351.0 | 0 |
| 350.0 | 0 |
| 349.0 | 0 |
| 348.0 | 0 |
| 347.0 | 0 |
| 346.0 | 0 |
| 345.0 | 0 |
| 344.0 | 0 |
| 343.0 | 0 |
| 342.0 | 0 |
| 341.0 | 0 |
| 340.0 | 0 |
| 339.0 | 0 |
| 338.0 | 0 |
| 337.0 | 0 |
| 336.0 | 0 |
| 335.0 | 0 |
| 334.0 | 0 |
| 333.0 | 0 |
| 332.0 | 0 |
| 331.0 | 0 |
| 330.0 | 0 |
| 329.0 | 0 |
| 328.0 | 0 |
| 327.0 | 0 |
| 326.0 | 0 |
| 325.0 | 0 |
| 324.0 | 0 |
| 323.0 | 0 |
| 322.0 | 0 |
| 321.0 | 0 |
| 320.0 | 0 |
| 319.0 | 0 |
| 318.0 | 0 |
| 317.0 | 0 |
| 316.0 | 0 |
| 315.0 | 0 |
| 314.0 | 0 |
| 313.0 | 0 |
| 312.0 | 0 |
| 311.0 | 0 |
| 310.0 | 0 |
| 309.0 | 0 |
| 308.0 | 0 |
| 307.0 | 0 |
| 306.0 | 0 |
| 305.0 | 0 |
| 304.0 | 0 |
| 303.0 | 0 |
| 302.0 | 0 |
| 301.0 | 0 |
| 300.0 | 0 |
| 299.0 | 0 |
| 298.0 | 0 |
| 297.0 | 0 |
| 296.0 | 0 |
| 295.0 | 0 |
| 294.0 | 0 |
| 293.0 | 0 |
| 292.0 | 0 |
| 291.0 | 0 |
| 290.0 | 0 |
| 289.0 | 0 |
| 288.0 | 0 |
| 287.0 | 0 |
| 286.0 | 0 |
| 285.0 | 0 |
| 284.0 | 0 |
| 283.0 | 0 |